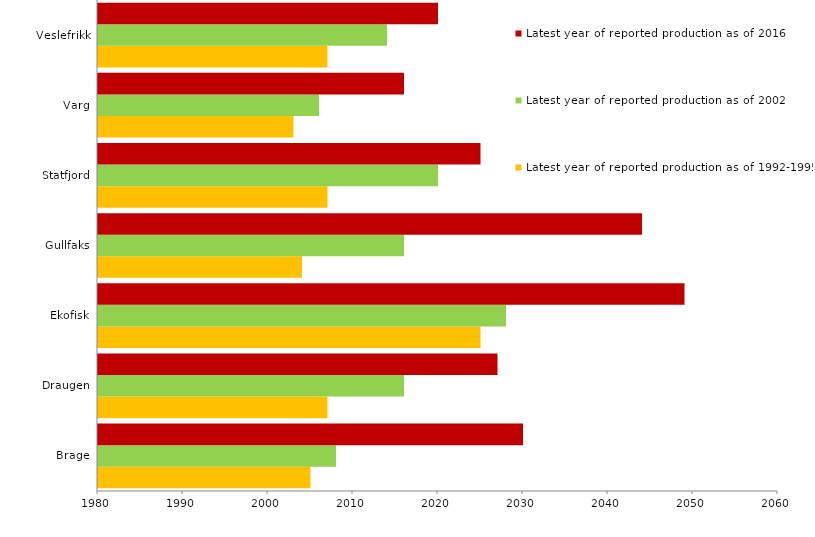
| Category | Latest year of reported production as of 1992-1995 | Latest year of reported production as of 2002 | Latest year of reported production as of 2016 |
|---|---|---|---|
| Brage | 2005 | 2008 | 2030 |
| Draugen | 2007 | 2016 | 2027 |
| Ekofisk | 2025 | 2028 | 2049 |
| Gullfaks | 2004 | 2016 | 2044 |
| Statfjord | 2007 | 2020 | 2025 |
| Varg | 2003 | 2006 | 2016 |
| Veslefrikk | 2007 | 2014 | 2020 |